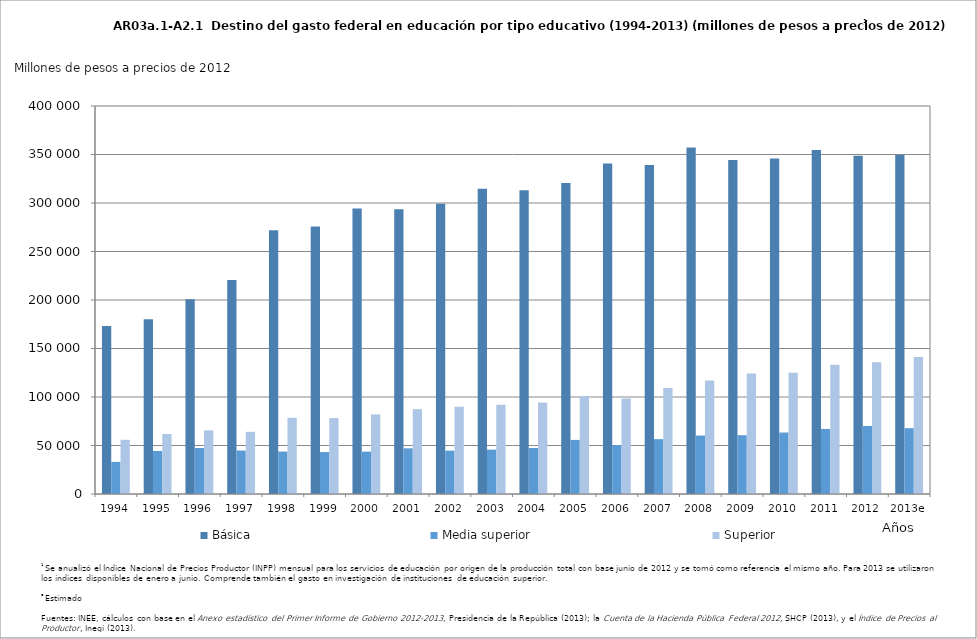
| Category | Básica | Media superior | Superior |
|---|---|---|---|
| 1994 | 173314.059 | 33101.563 | 55881.42 |
| 1995 | 180152.422 | 44353.573 | 61884.09 |
| 1996 | 200744.808 | 47430.72 | 65602.784 |
| 1997 | 220687.689 | 44805.032 | 64103.378 |
| 1998 | 272023.941 | 43755.128 | 78557.78 |
| 1999 | 275713.72 | 43234.85 | 78281.978 |
| 2000 | 294399.975 | 43685.446 | 82061.589 |
| 2001 | 293547.192 | 47073.305 | 87504.421 |
| 2002 | 299215.629 | 44704.606 | 90052.756 |
| 2003 | 314649.296 | 45736.824 | 92082.13 |
| 2004 | 313190.893 | 47432.562 | 94358.694 |
| 2005 | 320530.864 | 55771.001 | 100993.952 |
| 2006 | 340734.455 | 50365.974 | 98581.841 |
| 2007 | 339085.979 | 56569.838 | 109190.468 |
| 2008 | 357309.806 | 60264.249 | 116990.577 |
| 2009 | 344323.868 | 60602.654 | 124219.039 |
| 2010 | 345906.05 | 63383.806 | 125060.955 |
| 2011 | 354759.028 | 67067.608 | 133345.316 |
| 2012 | 348647.14 | 70143.198 | 135750.578 |
| 2013e | 349602.948 | 67839.283 | 141176.953 |